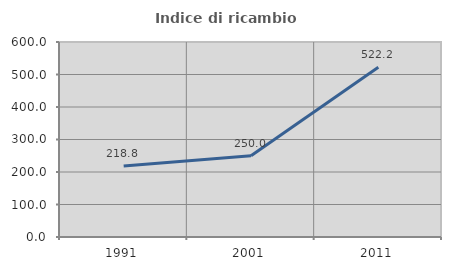
| Category | Indice di ricambio occupazionale  |
|---|---|
| 1991.0 | 218.75 |
| 2001.0 | 250 |
| 2011.0 | 522.222 |